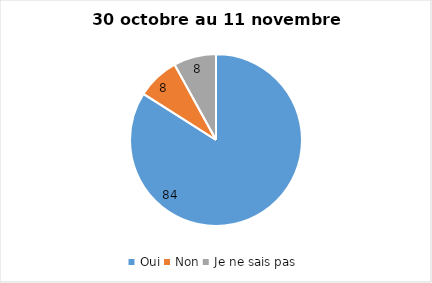
| Category | Series 0 |
|---|---|
| Oui | 84 |
| Non | 8 |
| Je ne sais pas | 8 |